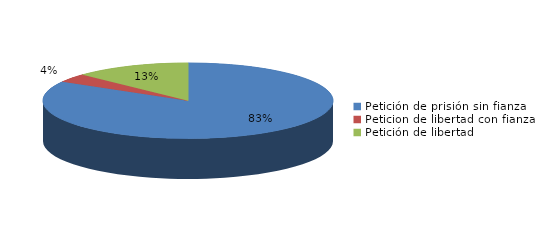
| Category | Series 0 |
|---|---|
| Petición de prisión sin fianza | 45 |
| Peticion de libertad con fianza | 2 |
| Petición de libertad | 7 |